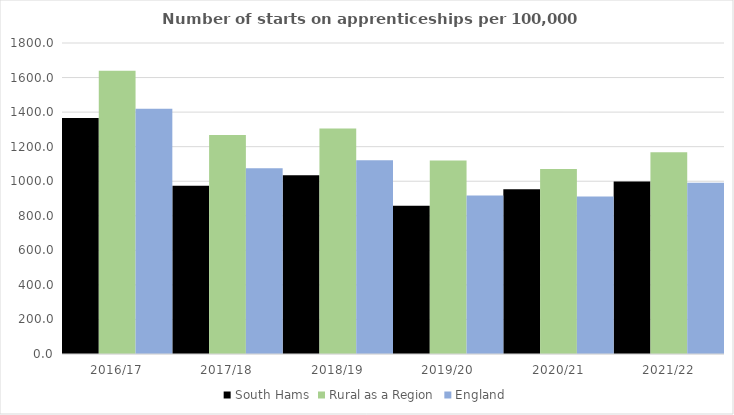
| Category | South Hams | Rural as a Region | England |
|---|---|---|---|
| 2016/17 | 1366 | 1638.789 | 1420 |
| 2017/18 | 974 | 1267.474 | 1075 |
| 2018/19 | 1035 | 1304.57 | 1122 |
| 2019/20 | 858 | 1119.662 | 918 |
| 2020/21 | 954 | 1070.748 | 912 |
| 2021/22 | 999 | 1167.68 | 991 |